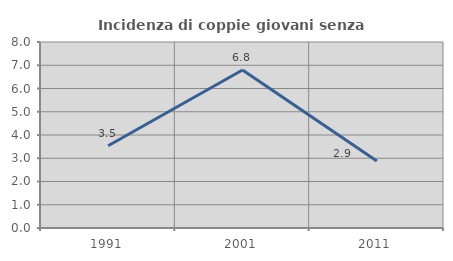
| Category | Incidenza di coppie giovani senza figli |
|---|---|
| 1991.0 | 3.54 |
| 2001.0 | 6.796 |
| 2011.0 | 2.885 |